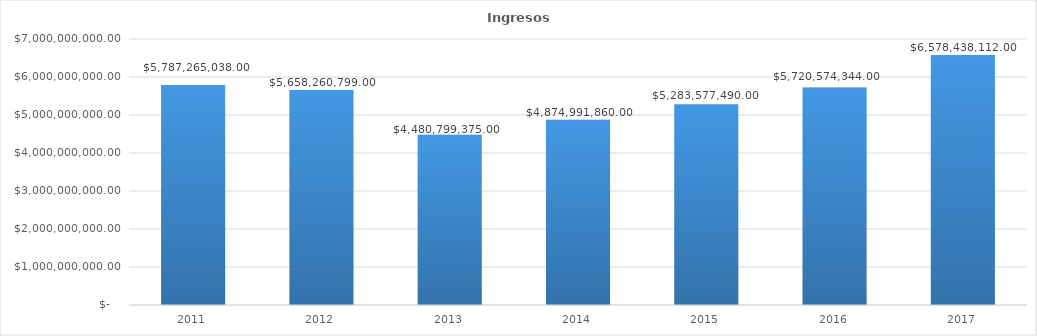
| Category | INGRESOS (TOTAL) |
|---|---|
| 2011.0 | 5787265038 |
| 2012.0 | 5658260799 |
| 2013.0 | 4480799375 |
| 2014.0 | 4874991860 |
| 2015.0 | 5283577490 |
| 2016.0 | 5720574344 |
| 2017.0 | 6578438112 |